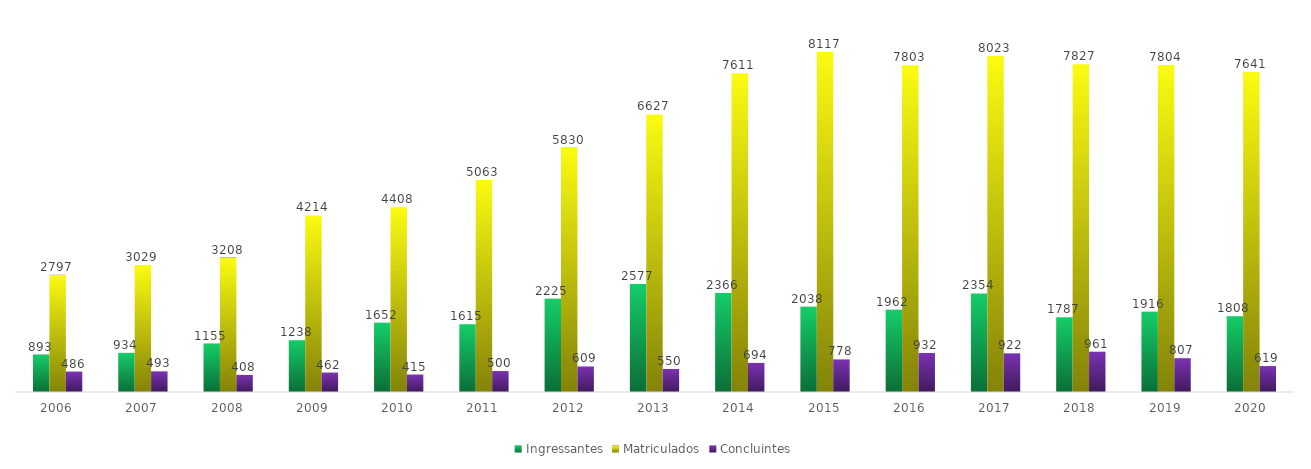
| Category | Ingressantes | Matriculados | Concluintes |
|---|---|---|---|
| 2006.0 | 893 | 2797 | 486 |
| 2007.0 | 934 | 3029 | 493 |
| 2008.0 | 1155 | 3208 | 408 |
| 2009.0 | 1238 | 4214 | 462 |
| 2010.0 | 1652 | 4408 | 415 |
| 2011.0 | 1615 | 5063 | 500 |
| 2012.0 | 2225 | 5830 | 609 |
| 2013.0 | 2577 | 6627 | 550 |
| 2014.0 | 2366 | 7611 | 694 |
| 2015.0 | 2038 | 8117 | 778 |
| 2016.0 | 1962 | 7803 | 932 |
| 2017.0 | 2354 | 8023 | 922 |
| 2018.0 | 1787 | 7827 | 961 |
| 2019.0 | 1916 | 7804 | 807 |
| 2020.0 | 1808 | 7641 | 619 |